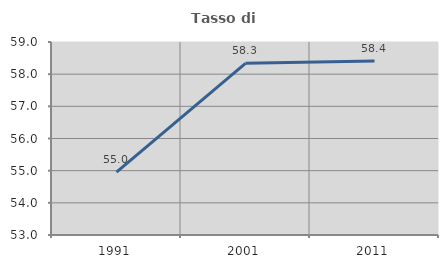
| Category | Tasso di occupazione   |
|---|---|
| 1991.0 | 54.955 |
| 2001.0 | 58.336 |
| 2011.0 | 58.41 |